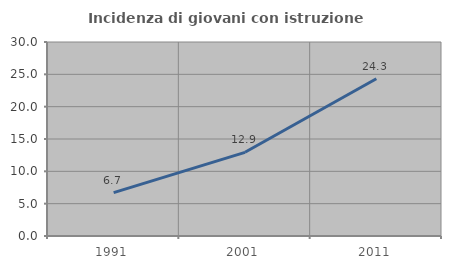
| Category | Incidenza di giovani con istruzione universitaria |
|---|---|
| 1991.0 | 6.699 |
| 2001.0 | 12.941 |
| 2011.0 | 24.318 |